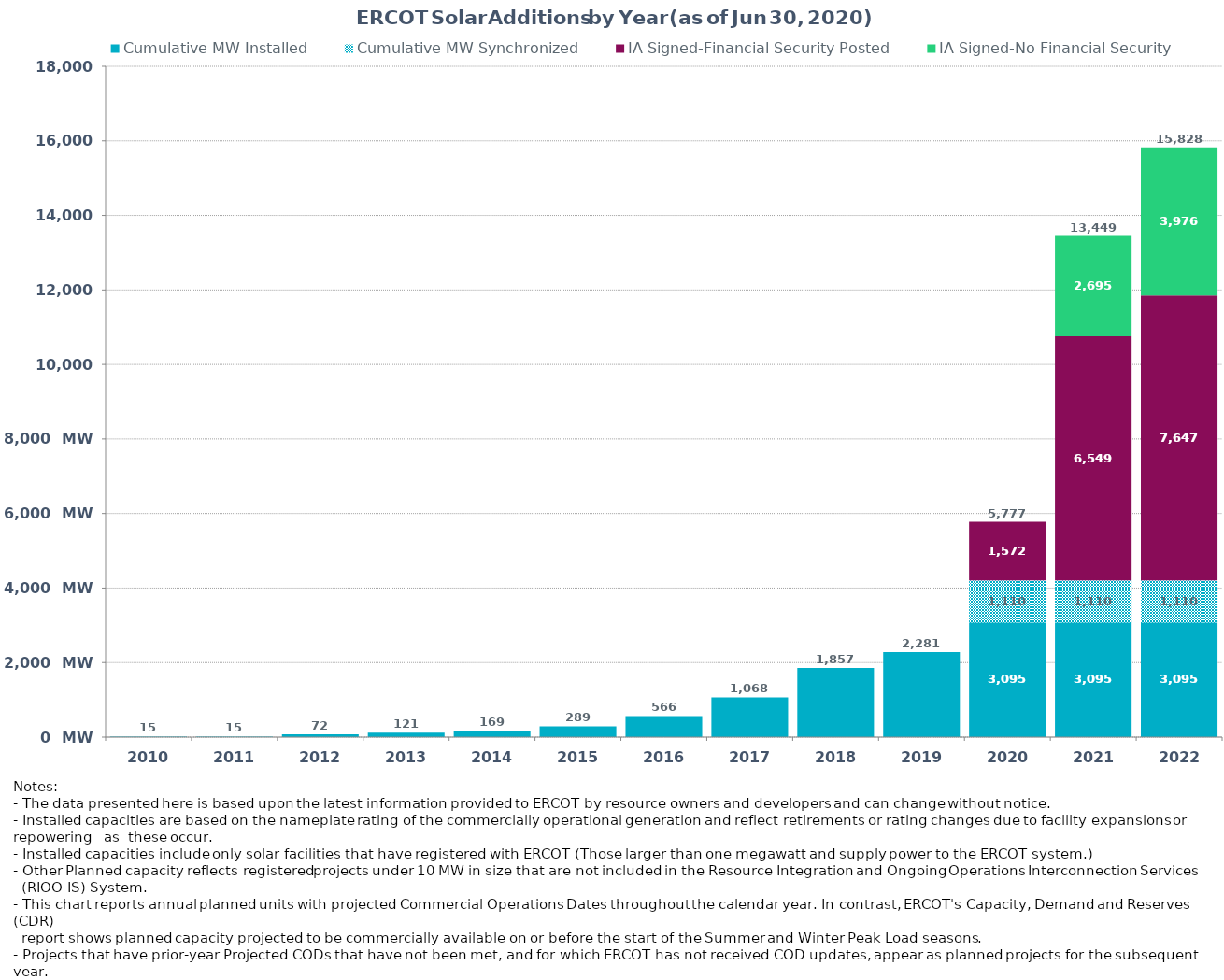
| Category | Cumulative MW Installed | Cumulative MW Synchronized | IA Signed-Financial Security Posted  | IA Signed-No Financial Security  | Other Planned | Cumulative Installed and Planned |
|---|---|---|---|---|---|---|
| 2010.0 | 15 | 0 | 0 | 0 | 0 | 15 |
| 2011.0 | 15 | 0 | 0 | 0 | 0 | 15 |
| 2012.0 | 72.3 | 0 | 0 | 0 | 0 | 72.3 |
| 2013.0 | 121.2 | 0 | 0 | 0 | 0 | 121.2 |
| 2014.0 | 168.7 | 0 | 0 | 0 | 0 | 168.7 |
| 2015.0 | 289.28 | 0 | 0 | 0 | 0 | 289.28 |
| 2016.0 | 565.78 | 0 | 0 | 0 | 0 | 565.78 |
| 2017.0 | 1067.78 | 0 | 0 | 0 | 0 | 1067.78 |
| 2018.0 | 1856.78 | 0 | 0 | 0 | 0 | 1856.78 |
| 2019.0 | 2281.38 | 0 | 0 | 0 | 0 | 2281.38 |
| 2020.0 | 3094.52 | 1110 | 1572.11 | 0 | 0 | 5776.63 |
| 2021.0 | 3094.52 | 1110 | 6549 | 2695 | 0 | 13448.52 |
| 2022.0 | 3094.52 | 1110 | 7647.32 | 3975.73 | 0 | 15827.57 |